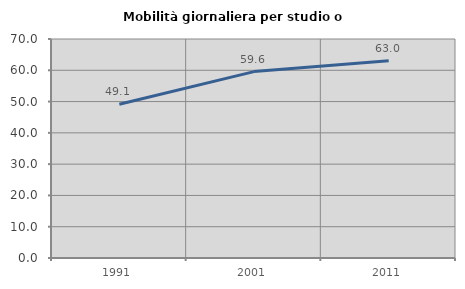
| Category | Mobilità giornaliera per studio o lavoro |
|---|---|
| 1991.0 | 49.145 |
| 2001.0 | 59.58 |
| 2011.0 | 63.016 |